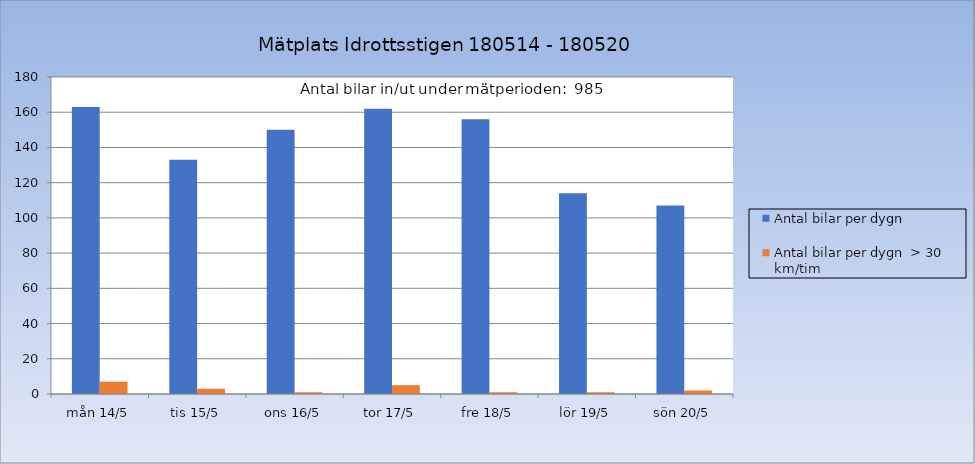
| Category | Antal bilar per dygn | Antal bilar per dygn  > 30 km/tim |
|---|---|---|
| mån 14/5 | 163 | 7 |
| tis 15/5 | 133 | 3 |
| ons 16/5 | 150 | 1 |
| tor 17/5 | 162 | 5 |
| fre 18/5 | 156 | 1 |
| lör 19/5 | 114 | 1 |
| sön 20/5 | 107 | 2 |